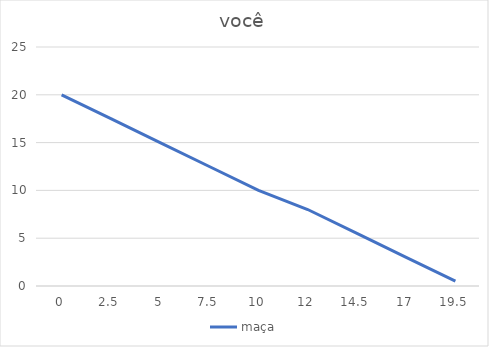
| Category | maça |
|---|---|
| 0.0 | 20 |
| 2.5 | 17.5 |
| 5.0 | 15 |
| 7.5 | 12.5 |
| 10.0 | 10 |
| 12.0 | 8 |
| 14.5 | 5.5 |
| 17.0 | 3 |
| 19.5 | 0.5 |